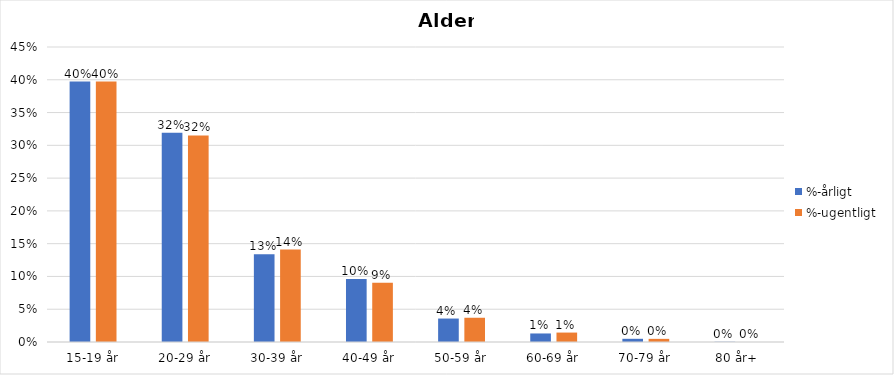
| Category | %-årligt | %-ugentligt |
|---|---|---|
| 15-19 år | 0.397 | 0.397 |
| 20-29 år | 0.319 | 0.315 |
| 30-39 år | 0.134 | 0.141 |
| 40-49 år | 0.096 | 0.09 |
| 50-59 år | 0.036 | 0.037 |
| 60-69 år | 0.013 | 0.014 |
| 70-79 år | 0.005 | 0.005 |
| 80 år+ | 0 | 0 |